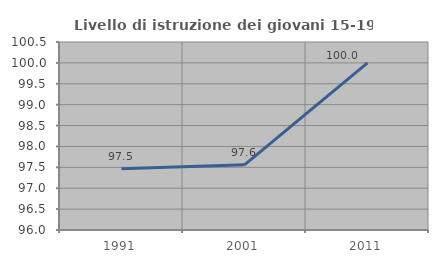
| Category | Livello di istruzione dei giovani 15-19 anni |
|---|---|
| 1991.0 | 97.468 |
| 2001.0 | 97.561 |
| 2011.0 | 100 |